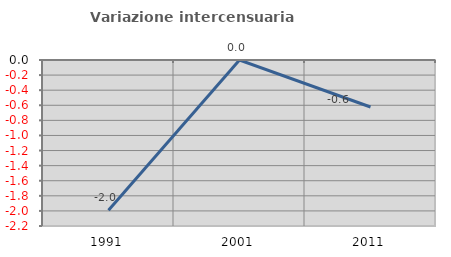
| Category | Variazione intercensuaria annua |
|---|---|
| 1991.0 | -1.991 |
| 2001.0 | 0 |
| 2011.0 | -0.622 |